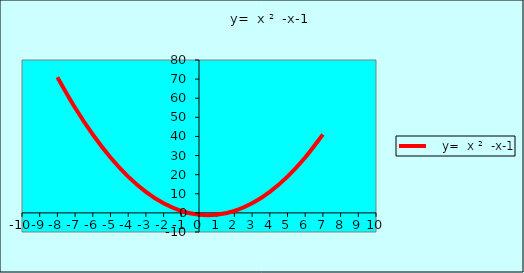
| Category |    y=  x ²  -x-1 |
|---|---|
| -8.0 | 71 |
| -7.0 | 55 |
| -6.0 | 41 |
| -5.0 | 29 |
| -4.0 | 19 |
| -3.0 | 11 |
| -2.0 | 5 |
| -1.0 | 1 |
| 0.0 | -1 |
| 1.0 | -1 |
| 2.0 | 1 |
| 3.0 | 5 |
| 4.0 | 11 |
| 5.0 | 19 |
| 6.0 | 29 |
| 7.0 | 41 |